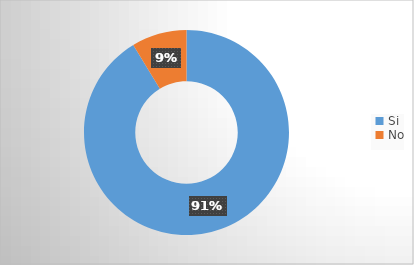
| Category | Series 0 |
|---|---|
| Si | 0.913 |
| No | 0.087 |